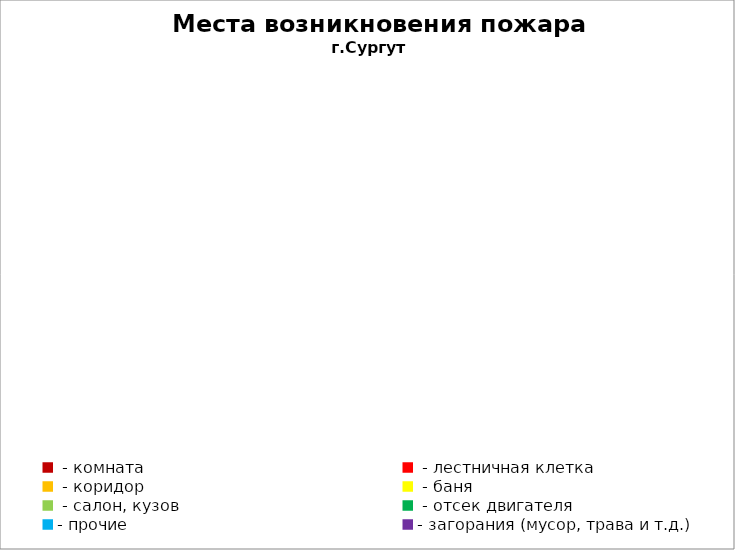
| Category | Места возникновения пожара |
|---|---|
|  - комната | 48 |
|  - лестничная клетка | 16 |
|  - коридор | 7 |
|  - баня | 18 |
|  - салон, кузов | 9 |
|  - отсек двигателя | 20 |
| - прочие | 85 |
| - загорания (мусор, трава и т.д.)  | 148 |